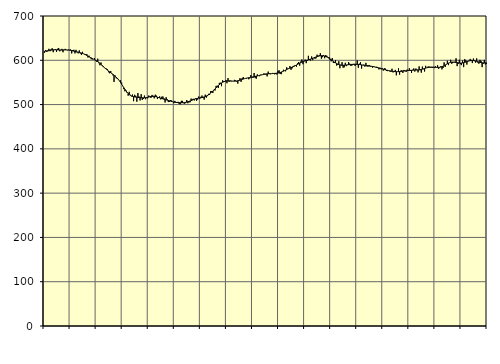
| Category | Piggar | Series 1 |
|---|---|---|
| nan | 617 | 620.32 |
| 87.0 | 622.9 | 620.66 |
| 87.0 | 619.2 | 621.11 |
| 87.0 | 620.1 | 621.69 |
| 87.0 | 625.9 | 622.17 |
| 87.0 | 620.5 | 622.62 |
| 87.0 | 625 | 622.97 |
| 87.0 | 627.2 | 623.31 |
| 87.0 | 618.3 | 623.55 |
| 87.0 | 624.4 | 623.66 |
| 87.0 | 625.3 | 623.67 |
| 87.0 | 618.9 | 623.6 |
| nan | 626 | 623.5 |
| 88.0 | 627.8 | 623.41 |
| 88.0 | 620.4 | 623.36 |
| 88.0 | 622.5 | 623.37 |
| 88.0 | 625.8 | 623.39 |
| 88.0 | 618.2 | 623.44 |
| 88.0 | 623.8 | 623.46 |
| 88.0 | 625.8 | 623.43 |
| 88.0 | 623.8 | 623.37 |
| 88.0 | 622.6 | 623.25 |
| 88.0 | 624.1 | 623.03 |
| 88.0 | 623.7 | 622.75 |
| nan | 624.5 | 622.37 |
| 89.0 | 615.5 | 621.89 |
| 89.0 | 623.2 | 621.32 |
| 89.0 | 623.7 | 620.73 |
| 89.0 | 615.5 | 620.1 |
| 89.0 | 623.6 | 619.49 |
| 89.0 | 617.8 | 618.9 |
| 89.0 | 615.7 | 618.3 |
| 89.0 | 622.3 | 617.69 |
| 89.0 | 615.3 | 617.06 |
| 89.0 | 611.9 | 616.36 |
| 89.0 | 619.1 | 615.53 |
| nan | 614.4 | 614.57 |
| 90.0 | 612.7 | 613.48 |
| 90.0 | 613.9 | 612.26 |
| 90.0 | 613.6 | 610.91 |
| 90.0 | 606.3 | 609.52 |
| 90.0 | 610.4 | 608.11 |
| 90.0 | 606 | 606.7 |
| 90.0 | 602.4 | 605.34 |
| 90.0 | 602.1 | 604.03 |
| 90.0 | 602.8 | 602.74 |
| 90.0 | 605 | 601.45 |
| 90.0 | 598.8 | 600.07 |
| nan | 596.7 | 598.54 |
| 91.0 | 603.6 | 596.88 |
| 91.0 | 593.4 | 595.02 |
| 91.0 | 588.7 | 592.96 |
| 91.0 | 595 | 590.77 |
| 91.0 | 587.6 | 588.49 |
| 91.0 | 584.6 | 586.17 |
| 91.0 | 583.7 | 583.89 |
| 91.0 | 580.7 | 581.71 |
| 91.0 | 581.2 | 579.63 |
| 91.0 | 579.7 | 577.63 |
| 91.0 | 573 | 575.68 |
| nan | 570.7 | 573.76 |
| 92.0 | 575.6 | 571.86 |
| 92.0 | 569.6 | 569.98 |
| 92.0 | 566 | 568.15 |
| 92.0 | 551.1 | 566.28 |
| 92.0 | 565.6 | 564.27 |
| 92.0 | 559.4 | 562.07 |
| 92.0 | 558.6 | 559.56 |
| 92.0 | 557.8 | 556.68 |
| 92.0 | 553.2 | 553.4 |
| 92.0 | 554.7 | 549.77 |
| 92.0 | 549.6 | 545.94 |
| nan | 541.8 | 542.02 |
| 93.0 | 534.9 | 538.1 |
| 93.0 | 530 | 534.35 |
| 93.0 | 532.2 | 530.87 |
| 93.0 | 526.4 | 527.72 |
| 93.0 | 520.1 | 525.01 |
| 93.0 | 528.8 | 522.76 |
| 93.0 | 522.1 | 521 |
| 93.0 | 518.5 | 519.67 |
| 93.0 | 522.6 | 518.66 |
| 93.0 | 507.6 | 517.9 |
| 93.0 | 522.1 | 517.3 |
| nan | 519.8 | 516.85 |
| 94.0 | 506.5 | 516.51 |
| 94.0 | 526 | 516.23 |
| 94.0 | 518.2 | 516 |
| 94.0 | 509.3 | 515.78 |
| 94.0 | 523.4 | 515.58 |
| 94.0 | 510.5 | 515.43 |
| 94.0 | 513 | 515.32 |
| 94.0 | 520.3 | 515.32 |
| 94.0 | 512.1 | 515.49 |
| 94.0 | 514.6 | 515.85 |
| 94.0 | 514.1 | 516.38 |
| nan | 520.4 | 516.97 |
| 95.0 | 518.4 | 517.6 |
| 95.0 | 515.1 | 518.13 |
| 95.0 | 521.8 | 518.43 |
| 95.0 | 519.9 | 518.53 |
| 95.0 | 514.1 | 518.39 |
| 95.0 | 522.4 | 517.98 |
| 95.0 | 520.1 | 517.4 |
| 95.0 | 512.6 | 516.71 |
| 95.0 | 514.8 | 515.94 |
| 95.0 | 518.4 | 515.16 |
| 95.0 | 511.7 | 514.38 |
| nan | 517.8 | 513.63 |
| 96.0 | 518.2 | 512.89 |
| 96.0 | 514 | 512.18 |
| 96.0 | 504.7 | 511.48 |
| 96.0 | 516.6 | 510.76 |
| 96.0 | 511.9 | 510.03 |
| 96.0 | 505.7 | 509.32 |
| 96.0 | 505.9 | 508.58 |
| 96.0 | 509.8 | 507.82 |
| 96.0 | 509.3 | 507.09 |
| 96.0 | 505.9 | 506.41 |
| 96.0 | 503.1 | 505.83 |
| nan | 508.3 | 505.35 |
| 97.0 | 503.7 | 504.96 |
| 97.0 | 504.8 | 504.65 |
| 97.0 | 506.2 | 504.44 |
| 97.0 | 501.4 | 504.31 |
| 97.0 | 500.5 | 504.2 |
| 97.0 | 508.4 | 504.14 |
| 97.0 | 508.4 | 504.18 |
| 97.0 | 503.1 | 504.32 |
| 97.0 | 502 | 504.58 |
| 97.0 | 503.3 | 505.01 |
| 97.0 | 510.2 | 505.6 |
| nan | 503 | 506.34 |
| 98.0 | 505.2 | 507.17 |
| 98.0 | 505.1 | 508.08 |
| 98.0 | 513.5 | 509.03 |
| 98.0 | 511.9 | 510.03 |
| 98.0 | 513.1 | 511.03 |
| 98.0 | 509.4 | 511.98 |
| 98.0 | 514 | 512.8 |
| 98.0 | 508.7 | 513.5 |
| 98.0 | 511.2 | 514.1 |
| 98.0 | 518.1 | 514.6 |
| 98.0 | 513.4 | 515 |
| nan | 517.5 | 515.4 |
| 99.0 | 520.4 | 515.88 |
| 99.0 | 515 | 516.5 |
| 99.0 | 511.2 | 517.25 |
| 99.0 | 522.4 | 518.12 |
| 99.0 | 515.7 | 519.2 |
| 99.0 | 519.1 | 520.52 |
| 99.0 | 524.2 | 522.08 |
| 99.0 | 521.8 | 523.92 |
| 99.0 | 530.2 | 525.99 |
| 99.0 | 530.2 | 528.23 |
| 99.0 | 526.2 | 530.58 |
| nan | 532.9 | 532.99 |
| 0.0 | 531.7 | 535.44 |
| 0.0 | 542.1 | 537.87 |
| 0.0 | 542.5 | 540.3 |
| 0.0 | 537.4 | 542.67 |
| 0.0 | 549 | 544.91 |
| 0.0 | 549.3 | 546.98 |
| 0.0 | 541.5 | 548.82 |
| 0.0 | 554.8 | 550.33 |
| 0.0 | 553.1 | 551.51 |
| 0.0 | 551.4 | 552.36 |
| 0.0 | 555.4 | 552.98 |
| nan | 548.2 | 553.41 |
| 1.0 | 559.7 | 553.64 |
| 1.0 | 551.5 | 553.7 |
| 1.0 | 552.6 | 553.6 |
| 1.0 | 552.5 | 553.39 |
| 1.0 | 552.8 | 553.14 |
| 1.0 | 553.3 | 552.93 |
| 1.0 | 555.8 | 552.84 |
| 1.0 | 554.4 | 552.95 |
| 1.0 | 552.1 | 553.26 |
| 1.0 | 547.4 | 553.77 |
| 1.0 | 553.3 | 554.45 |
| nan | 559.6 | 555.23 |
| 2.0 | 551.4 | 556.07 |
| 2.0 | 559.7 | 556.87 |
| 2.0 | 562.2 | 557.63 |
| 2.0 | 558.4 | 558.37 |
| 2.0 | 558.8 | 559.05 |
| 2.0 | 558.6 | 559.63 |
| 2.0 | 559.9 | 560.14 |
| 2.0 | 557.2 | 560.59 |
| 2.0 | 558.9 | 561.04 |
| 2.0 | 566.6 | 561.52 |
| 2.0 | 561.5 | 562.04 |
| nan | 560.2 | 562.56 |
| 3.0 | 571.3 | 563.09 |
| 3.0 | 559.9 | 563.66 |
| 3.0 | 558.5 | 564.21 |
| 3.0 | 568.1 | 564.74 |
| 3.0 | 565.2 | 565.29 |
| 3.0 | 564.1 | 565.85 |
| 3.0 | 567.3 | 566.44 |
| 3.0 | 567.5 | 567.04 |
| 3.0 | 567.8 | 567.64 |
| 3.0 | 570.2 | 568.21 |
| 3.0 | 569.5 | 568.71 |
| nan | 567.8 | 569.12 |
| 4.0 | 563.7 | 569.38 |
| 4.0 | 574.4 | 569.52 |
| 4.0 | 570.5 | 569.66 |
| 4.0 | 568.4 | 569.81 |
| 4.0 | 569.7 | 569.93 |
| 4.0 | 571.4 | 570.07 |
| 4.0 | 569.8 | 570.24 |
| 4.0 | 568.3 | 570.41 |
| 4.0 | 569.1 | 570.6 |
| 4.0 | 567.9 | 570.85 |
| 4.0 | 576.1 | 571.18 |
| nan | 577.4 | 571.69 |
| 5.0 | 569.1 | 572.4 |
| 5.0 | 568.6 | 573.31 |
| 5.0 | 573.4 | 574.33 |
| 5.0 | 578.6 | 575.45 |
| 5.0 | 576.3 | 576.65 |
| 5.0 | 575.1 | 577.87 |
| 5.0 | 584.1 | 579.06 |
| 5.0 | 581 | 580.23 |
| 5.0 | 581 | 581.37 |
| 5.0 | 586.9 | 582.43 |
| 5.0 | 578.5 | 583.44 |
| nan | 581.8 | 584.44 |
| 6.0 | 587.2 | 585.48 |
| 6.0 | 588 | 586.67 |
| 6.0 | 587.3 | 588.01 |
| 6.0 | 585.6 | 589.41 |
| 6.0 | 593 | 590.81 |
| 6.0 | 596.1 | 592.22 |
| 6.0 | 587.9 | 593.55 |
| 6.0 | 597.2 | 594.78 |
| 6.0 | 601.9 | 595.91 |
| 6.0 | 591.1 | 596.96 |
| 6.0 | 598.7 | 597.95 |
| nan | 601.8 | 598.88 |
| 7.0 | 593.5 | 599.73 |
| 7.0 | 598.6 | 600.49 |
| 7.0 | 610.1 | 601.19 |
| 7.0 | 600.4 | 601.92 |
| 7.0 | 599.5 | 602.73 |
| 7.0 | 608.6 | 603.6 |
| 7.0 | 600.3 | 604.56 |
| 7.0 | 605.8 | 605.56 |
| 7.0 | 603.5 | 606.52 |
| 7.0 | 604.4 | 607.43 |
| 7.0 | 612.7 | 608.27 |
| nan | 610.1 | 609.01 |
| 8.0 | 611.3 | 609.62 |
| 8.0 | 615.9 | 610.07 |
| 8.0 | 603.7 | 610.27 |
| 8.0 | 607 | 610.21 |
| 8.0 | 612 | 609.88 |
| 8.0 | 604.7 | 609.31 |
| 8.0 | 611.9 | 608.48 |
| 8.0 | 610 | 607.42 |
| 8.0 | 606.3 | 606.18 |
| 8.0 | 607.4 | 604.76 |
| 8.0 | 600.9 | 603.14 |
| nan | 597.6 | 601.35 |
| 9.0 | 604.9 | 599.49 |
| 9.0 | 593.8 | 597.62 |
| 9.0 | 594.2 | 595.82 |
| 9.0 | 600.4 | 594.2 |
| 9.0 | 588.1 | 592.75 |
| 9.0 | 589.6 | 591.46 |
| 9.0 | 597.9 | 590.4 |
| 9.0 | 582 | 589.59 |
| 9.0 | 589.8 | 589.05 |
| 9.0 | 595.6 | 588.78 |
| 9.0 | 583.3 | 588.75 |
| nan | 584.2 | 588.92 |
| 10.0 | 594.3 | 589.16 |
| 10.0 | 586.8 | 589.45 |
| 10.0 | 589.2 | 589.76 |
| 10.0 | 596 | 590.03 |
| 10.0 | 592.6 | 590.26 |
| 10.0 | 587.7 | 590.49 |
| 10.0 | 587.8 | 590.67 |
| 10.0 | 589.9 | 590.82 |
| 10.0 | 591.9 | 590.9 |
| 10.0 | 587.5 | 590.9 |
| 10.0 | 591.9 | 590.83 |
| nan | 599.8 | 590.73 |
| 11.0 | 583.2 | 590.57 |
| 11.0 | 592.5 | 590.33 |
| 11.0 | 595.9 | 590.04 |
| 11.0 | 581.2 | 589.69 |
| 11.0 | 589 | 589.28 |
| 11.0 | 590.2 | 588.89 |
| 11.0 | 585.7 | 588.53 |
| 11.0 | 594.2 | 588.21 |
| 11.0 | 586.1 | 587.92 |
| 11.0 | 586 | 587.64 |
| 11.0 | 589.4 | 587.34 |
| nan | 585.5 | 586.96 |
| 12.0 | 585.9 | 586.53 |
| 12.0 | 583.6 | 586.06 |
| 12.0 | 586.8 | 585.51 |
| 12.0 | 585.5 | 584.92 |
| 12.0 | 583.9 | 584.36 |
| 12.0 | 585.4 | 583.78 |
| 12.0 | 584.4 | 583.19 |
| 12.0 | 579.4 | 582.57 |
| 12.0 | 583.2 | 581.89 |
| 12.0 | 579.7 | 581.19 |
| 12.0 | 582.1 | 580.47 |
| nan | 576.7 | 579.72 |
| 13.0 | 582 | 579.03 |
| 13.0 | 581 | 578.4 |
| 13.0 | 575.9 | 577.8 |
| 13.0 | 575.5 | 577.23 |
| 13.0 | 577 | 576.69 |
| 13.0 | 574.9 | 576.17 |
| 13.0 | 574.1 | 575.69 |
| 13.0 | 580.9 | 575.28 |
| 13.0 | 572.6 | 574.93 |
| 13.0 | 575.1 | 574.66 |
| 13.0 | 578.3 | 574.47 |
| nan | 566.1 | 574.35 |
| 14.0 | 574.6 | 574.29 |
| 14.0 | 581.8 | 574.29 |
| 14.0 | 567.6 | 574.41 |
| 14.0 | 576.5 | 574.67 |
| 14.0 | 577.7 | 575.01 |
| 14.0 | 571.4 | 575.39 |
| 14.0 | 578.2 | 575.77 |
| 14.0 | 576.2 | 576.1 |
| 14.0 | 573.7 | 576.39 |
| 14.0 | 579 | 576.63 |
| 14.0 | 576 | 576.82 |
| nan | 581.9 | 577.02 |
| 15.0 | 575.8 | 577.22 |
| 15.0 | 571.3 | 577.39 |
| 15.0 | 578.5 | 577.55 |
| 15.0 | 581.6 | 577.72 |
| 15.0 | 574.6 | 577.86 |
| 15.0 | 581.4 | 577.98 |
| 15.0 | 578.6 | 578.11 |
| 15.0 | 572.7 | 578.27 |
| 15.0 | 586.2 | 578.51 |
| 15.0 | 577.5 | 578.88 |
| 15.0 | 572.1 | 579.38 |
| nan | 585.7 | 580.02 |
| 16.0 | 579.9 | 580.75 |
| 16.0 | 574.7 | 581.56 |
| 16.0 | 587.5 | 582.35 |
| 16.0 | 582.9 | 583.06 |
| 16.0 | 585.4 | 583.65 |
| 16.0 | 586.1 | 584.09 |
| 16.0 | 585.1 | 584.4 |
| 16.0 | 583.6 | 584.6 |
| 16.0 | 582.7 | 584.63 |
| 16.0 | 583.8 | 584.53 |
| 16.0 | 582.4 | 584.36 |
| nan | 586.5 | 584.15 |
| 17.0 | 584.7 | 583.95 |
| 17.0 | 588.8 | 583.88 |
| 17.0 | 580.7 | 583.96 |
| 17.0 | 583.7 | 584.23 |
| 17.0 | 586.4 | 584.77 |
| 17.0 | 579.5 | 585.57 |
| 17.0 | 582.6 | 586.64 |
| 17.0 | 595.3 | 587.89 |
| 17.0 | 584.8 | 589.31 |
| 17.0 | 591.4 | 590.81 |
| 17.0 | 599 | 592.26 |
| nan | 589.1 | 593.55 |
| 18.0 | 594.4 | 594.59 |
| 18.0 | 601.1 | 595.32 |
| 18.0 | 592.2 | 595.78 |
| 18.0 | 593.8 | 595.95 |
| 18.0 | 595.3 | 595.85 |
| 18.0 | 596.6 | 595.58 |
| 18.0 | 604.4 | 595.23 |
| 18.0 | 586.8 | 594.83 |
| 18.0 | 591.9 | 594.41 |
| 18.0 | 601.2 | 594.07 |
| 18.0 | 591.1 | 593.87 |
| nan | 589.1 | 593.87 |
| 19.0 | 599.2 | 594.1 |
| 19.0 | 584.6 | 594.58 |
| 19.0 | 602.6 | 595.24 |
| 19.0 | 599.8 | 596.06 |
| 19.0 | 590.3 | 596.96 |
| 19.0 | 598.1 | 597.79 |
| 19.0 | 598.9 | 598.46 |
| 19.0 | 603.1 | 598.98 |
| 19.0 | 600.9 | 599.35 |
| 19.0 | 593.7 | 599.46 |
| 19.0 | 603.9 | 599.32 |
| nan | 598.1 | 598.99 |
| 20.0 | 594.6 | 598.45 |
| 20.0 | 604.2 | 597.75 |
| 20.0 | 594.8 | 596.98 |
| 20.0 | 592.3 | 596.15 |
| 20.0 | 601.1 | 595.39 |
| 20.0 | 598.6 | 594.79 |
| 20.0 | 584.5 | 594.34 |
| 20.0 | 591.8 | 594.07 |
| 20.0 | 601 | 593.99 |
| 20.0 | 590.6 | 594.12 |
| 20.0 | 591.9 | 594.45 |